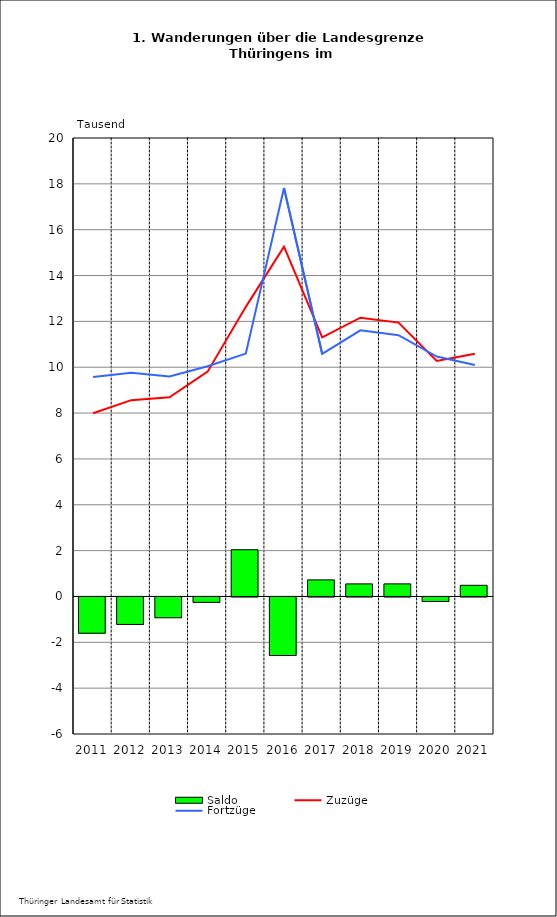
| Category | Saldo |
|---|---|
| 2011.0 | -1.582 |
| 2012.0 | -1.198 |
| 2013.0 | -0.906 |
| 2014.0 | -0.235 |
| 2015.0 | 2.039 |
| 2016.0 | -2.554 |
| 2017.0 | 0.723 |
| 2018.0 | 0.548 |
| 2019.0 | 0.549 |
| 2020.0 | -0.197 |
| 2021.0 | 0.487 |